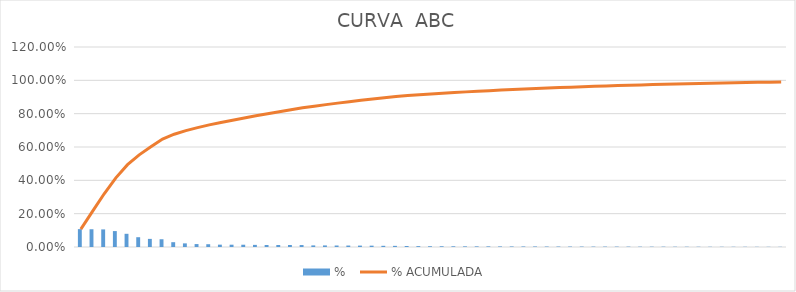
| Category |  %  |
|---|---|
| CONECTORIZAÇÃO, FECHAMENTO DE RACK E CERTIFICAÇÃO DE PONTOS DE LÓGICA  | 0.107 |
| CANALETA DE ALUMÍNIO COM TAMPA - 73X25MM - FORNECIMENTO E INSTALAÇÃO | 0.107 |
| CABO ELETRÔNICO CATEGORIA 6, INSTALADO EM EDIFICAÇÃO INSTITUCIONAL - FORNECIMENTO E INSTALAÇÃO. AF_11/2019 | 0.106 |
| CÂMERA IP - POE - VIP 3260 Z FULL HD - ZOOM ÓPTICO 5X - LENTE 2.7MM - WDR REAL (120DB) - FORNECIMENTO E INSTALAÇÃO | 0.095 |
| ADMINISTRAÇÃO DE OBRAS | 0.079 |
| CÂMERA IP - POE - VIP 3230 B SÉRIE 3000 FULL HD - LENTE 2.8MM - FORNECIMENTO E INSTALAÇÃO | 0.059 |
| PATCH CORD, CATEGORIA 6, EXTENSAO DE 2,50 M - FORNECIMENTO E INSTALAÇÃO | 0.049 |
| PATCH PANEL 24 PORTAS, CATEGORIA 6 - FORNECIMENTO E INSTALAÇÃO. AF_11/2019 | 0.047 |
| HD DE 4TB - COMPATÍVEL COM NVR - REF. SEAGATE ST4000VX000 - FORNECIMENTO E INSTALAÇÃO | 0.029 |
| PORTA EQUIPAMENTOS P/ 3 RJ45 - PARA CANALETA DE ALUMÍNIO - FORNECIMENTO E INSTALAÇÃO | 0.022 |
| GRAVADOR DE VÍDEO NVR 32 CANAIS - RESOLUÇÃO DE GRAVAÇÃO 8MP(4K) - 8HD'S - REF. INTELBRAS NVD 7132 - FORNECIMENTO E INSTALAÇÃO | 0.018 |
| FIXAÇÃO DE PERFILADO 38X38, EM LAJE, COM BARRA ROSCADA - FORNECIMENTO E INSTALAÇÃO | 0.017 |
| FUSÃO E CERTIFICAÇÃO DE FIBRA ÓPTICA | 0.014 |
| RACK DE PISO 19" - PORTA ACRÍLICO - 44U X 670MM - FORNECIMENTO E INSTALAÇÃO | 0.014 |
| RACK DE PISO 19" - ABERTO - 44U X 450MM - FORNECIMENTO E INSTALAÇÃO | 0.014 |
| ELETROCALHA METÁLICA PERFURADA TIPO U 200X100MM  - FORNECIMENTO E INSTALAÇÃO | 0.013 |
| RACK DE PAREDE 19" 16U X 570MM FECHADO, PORTA ACRÍLICO - FORNECIMENTO E INSTALAÇÃO | 0.012 |
| PLACA COM 1 MÓDULO - RJ45 - PARA PORTA EQUIPAMENTO DA CANALETA DE ALUMÍNIO - FORNECIMENTO E INSTALAÇÃO | 0.012 |
| PLACA COM 2 MÓDULOS - RJ45 - PARA PORTA EQUIPAMENTO DA CANALETA DE ALUMÍNIO - FORNECIMENTO E INSTALAÇÃO | 0.012 |
| ELETROCALHA METÁLICA PERFURADA TIPO U 200X50MM - FORNECIMENTO E INSTALAÇÃO | 0.012 |
| PERFILADO GALVANIZADO À FOGO 38X38X6000MM - FORNECIMENTO E INSTALAÇÃO | 0.01 |
| CONECTOR MACHO RJ - 45, CATEGORIA 6 - FORNECIMENTO E INSTALAÇÃO | 0.009 |
| TOMADA DE REDE COM 1 MÓDULO - RJ45 - PARA CAIXA DE EMBUTIR 4X2" - FORNECIMENTO E INSTALAÇÃO | 0.009 |
| MÓDULO GBIC SFP - BI-DIRECIONAL - FORNECIMENTO E INSTALAÇÃO | 0.009 |
| DIO 19" 6FO MÍNIMO - MONOMODO -  COM CONECTOR SC - FORNECIMENTO E INSTALAÇÃO | 0.008 |
| GANCHO CURTO PARA PERFILADO 44X32MM - FORNECIMENTO E INSTALAÇÃO | 0.008 |
| CAIXA DE DERIVAÇÃO PARA CANALETA 73X25MM - FORNECIMENTO E INSTALAÇÃO | 0.007 |
| ELETRODUTO FLEXÍVEL CORRUGADO, PVC, DN 25 MM (3/4"), PARA CIRCUITOS TERMINAIS, INSTALADO EM FORRO - FORNECIMENTO E INSTALAÇÃO. AF_12/2015 | 0.007 |
| ESCAVAÇÃO MANUAL DE VALA COM PROFUNDIDADE MENOR OU IGUAL A 1,30 M. AF_02/2021 | 0.006 |
| ELETRODUTO DE AÇO GALVANIZADO, CLASSE LEVE, DN 20 MM (3/4), APARENTE , INSTALADO EM PAREDE - FORNECIMENTO E INSTALAÇÃO. AF_11/2016_P | 0.005 |
| ELETROCALHA METÁLICA PERFURADA TIPO U 100X50MM - FORNECIMENTO E INSTALAÇÃO | 0.005 |
| RACK DE PISO 19" - PORTA ACRÍLICO - 22U X 670MM - FORNECIMENTO E INSTALAÇÃO | 0.004 |
| FIXAÇÃO DE ELETROCALHA 200X50, EM LAJE, COM BARRA ROSCADA - FORNECIMENTO E INSTALAÇÃO | 0.004 |
| FIXAÇÃO DE ELETROCALHA 200X100, EM LAJE, COM BARRA ROSCADA - FORNECIMENTO E INSTALAÇÃO | 0.004 |
| FIBRA ÓPTICA - 6FO - MONOMODO - FORNECIMENTO E INSTALAÇÃO | 0.004 |
| REATERRO MANUAL APILOADO COM SOQUETE. AF_10/2017 | 0.004 |
| ADAPTADOR CANALETA DE ALUMÍNIO 73X25MM PARA ELETRODUTO - FORNECIMENTO E INSTALAÇÃO | 0.003 |
| TALA PLANA PERFURADA 38MM - FORNECIMENTO E INSTALAÇÃO | 0.003 |
| RASGO EM ALVENARIA PARA RAMAIS/ DISTRIBUIÇÃO COM DIAMETROS MENORES OU IGUAIS A 40 MM. AF_05/2015 | 0.003 |
| CURVA HORIZONTAL 90° PARA CANALETA DE ALUMÍNIO 73X25MM - FORNECIMENTO E INSTALAÇÃO | 0.003 |
| TOMADA DE REDE COM 1 MÓDULO - RJ45 - PARA CONDULETE DE ALUMÍNIO 3/4" - FORNECIMENTO E INSTALAÇÃO | 0.003 |
| FIBRA ÓPTICA - 48FO - MONOMODO - FORNECIMENTO E INSTALAÇÃO | 0.003 |
| GUIA DE CABOS FECHADO HORIZONTAL 19"X1U PRETO - FORNECIMENTO E INSTALAÇÃO | 0.003 |
| CURVA VERTICAL INTERNA  90° PARA CANALETA DE ALUMÍNIO 73X25MM - FORNECIMENTO E INSTALAÇÃO | 0.002 |
| CAIXA ENTERRADA ELÉTRICA RETANGULAR, EM ALVENARIA COM TIJOLOS CERÂMICOS MACIÇOS, FUNDO COM BRITA, DIMENSÕES INTERNAS: 0,4X0,4X0,4 M. AF_12/2020 | 0.002 |
| TALA PLANA PERFURADA 50MM - FORNECIMENTO E INSTALAÇÃO | 0.002 |
| DIO 19" 48FO MÍNIMO - MONOMODO-  COM CONECTOR SC - FORNECIMENTO E INSTALAÇÃO | 0.002 |
| LIMPEZA DE PISO CERÂMICO OU PORCELANATO COM VASSOURA A SECO. AF_04/2019 | 0.002 |
| PIGTAIL - CONECTOR SC - 1,5M - FORNECIMENTO E INSTALAÇÃO | 0.002 |
| PLACA DE FECHAMENTO CEGA - 1U - GABINETE PADRÃO 19" - FORNECIMENTO E INSTALAÇÃO | 0.002 |
| SAÍDA PERFILADO PARA ELETRODUTO 3/4" - FORNECIMENTO E INSTALAÇÃO | 0.002 |
| FIXAÇÃO DE ELETROCALHA 100X50, EM LAJE, COM BARRA ROSCADA - FORNECIMENTO E INSTALAÇÃO | 0.002 |
| ELETRODUTO DE AÇO GALVANIZADO, CLASSE LEVE, DN 25 MM (1), APARENTE, INSTALADO EM PAREDE - FORNECIMENTO E INSTALAÇÃO. AF_11/2016_P | 0.002 |
| PLACA CEGA - PARA CAIXA DE EMBUTIR 4X2" - FORNECIMENTO E INSTALAÇÃO | 0.002 |
| MONITOR LED 18,5", HD, WIDESCREEN - COM ENTRADA HDMI - FORNECIMENTO E INSTALAÇÃO | 0.001 |
| PLACA DE OBRA EM CHAPA DE ACO GALVANIZADO (1,50 X 1,50 M) | 0.001 |
| RÉGUA DE TOMADAS COM 10 TOMADAS PADRÃO BRASILEIRO PRETA - FORNECIMENTO E INSTALAÇÃO | 0.001 |
| RASGO EM CONTRAPISO PARA RAMAIS/ DISTRIBUIÇÃO COM DIÂMETROS MENORES OU IGUAIS A 40 MM. AF_05/2015 | 0.001 |
| CURVA 90° HORIZONTAL ELETROCALHA 200X50MM - FORNECIMENTO E INSTALAÇÃO | 0.001 |
| ELETRODUTO FLEXÍVEL CORRUGADO, PVC, DN 32 MM (1"), PARA CIRCUITOS TERMINAIS, INSTALADO EM FORRO - FORNECIMENTO E INSTALAÇÃO. AF_12/2015 | 0.001 |
| ELETRODUTO FLEXÍVEL CORRUGADO, PEAD, DN 50 (1 ½)  - FORNECIMENTO E INSTALAÇÃO. AF_04/2016 | 0.001 |